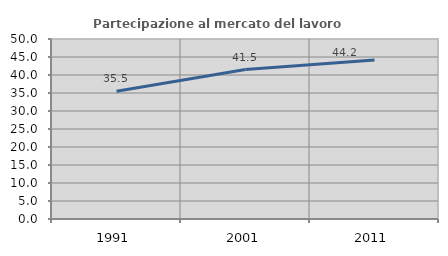
| Category | Partecipazione al mercato del lavoro  femminile |
|---|---|
| 1991.0 | 35.48 |
| 2001.0 | 41.512 |
| 2011.0 | 44.174 |